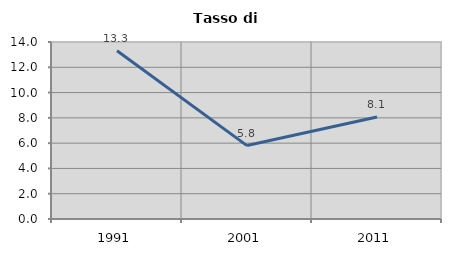
| Category | Tasso di disoccupazione   |
|---|---|
| 1991.0 | 13.312 |
| 2001.0 | 5.806 |
| 2011.0 | 8.065 |